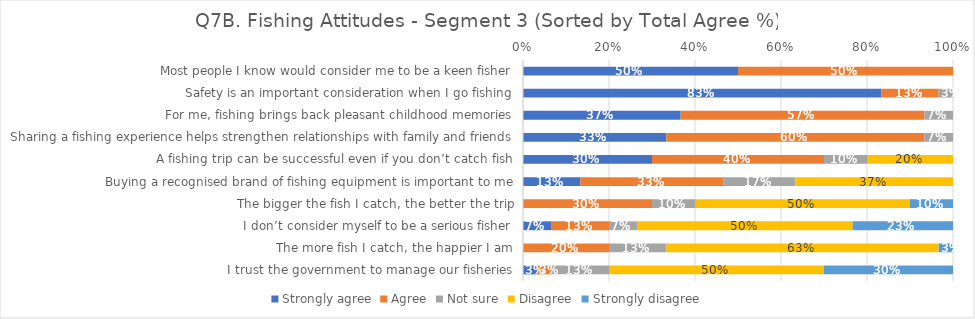
| Category | Strongly agree | Agree | Not sure | Disagree | Strongly disagree |
|---|---|---|---|---|---|
| Most people I know would consider me to be a keen fisher | 0.5 | 0.5 | 0 | 0 | 0 |
| Safety is an important consideration when I go fishing | 0.833 | 0.133 | 0.033 | 0 | 0 |
| For me, fishing brings back pleasant childhood memories | 0.367 | 0.567 | 0.067 | 0 | 0 |
| Sharing a fishing experience helps strengthen relationships with family and friends | 0.333 | 0.6 | 0.067 | 0 | 0 |
| A fishing trip can be successful even if you don’t catch fish | 0.3 | 0.4 | 0.1 | 0.2 | 0 |
| Buying a recognised brand of fishing equipment is important to me | 0.133 | 0.333 | 0.167 | 0.367 | 0 |
| The bigger the fish I catch, the better the trip | 0 | 0.3 | 0.1 | 0.5 | 0.1 |
| I don’t consider myself to be a serious fisher | 0.067 | 0.133 | 0.067 | 0.5 | 0.233 |
| The more fish I catch, the happier I am | 0 | 0.2 | 0.133 | 0.633 | 0.033 |
| I trust the government to manage our fisheries | 0.033 | 0.033 | 0.133 | 0.5 | 0.3 |